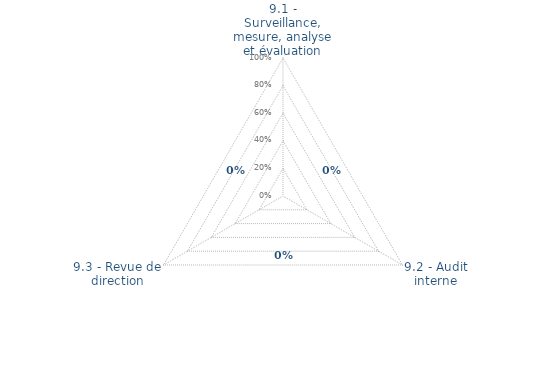
| Category | Art. 9 | limite de CONFORMITÉ |
|---|---|---|
| 9.1 - Surveillance, mesure, analyse et évaluation | 0 | 0 |
| 9.2 - Audit interne | 0 | 0 |
| 9.3 - Revue de direction | 0 | 0 |